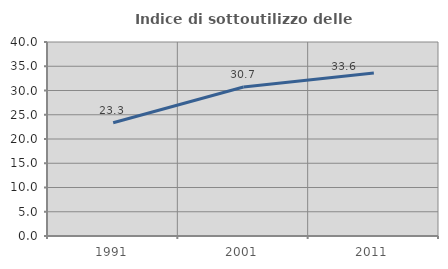
| Category | Indice di sottoutilizzo delle abitazioni  |
|---|---|
| 1991.0 | 23.342 |
| 2001.0 | 30.723 |
| 2011.0 | 33.606 |